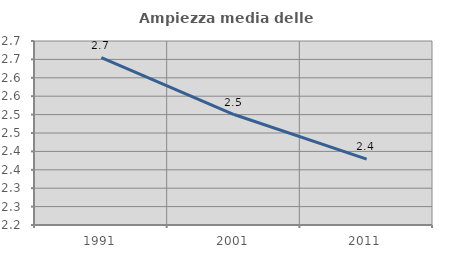
| Category | Ampiezza media delle famiglie |
|---|---|
| 1991.0 | 2.655 |
| 2001.0 | 2.5 |
| 2011.0 | 2.379 |